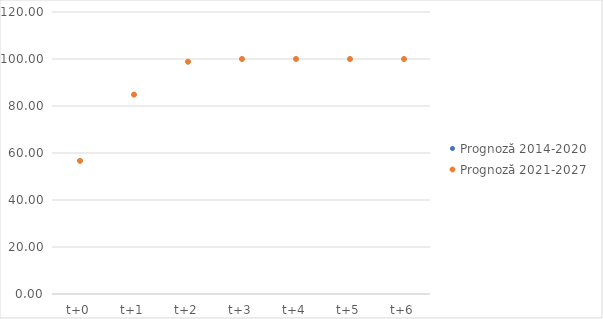
| Category | Prognoză 2014-2020 | Prognoză 2021-2027 |
|---|---|---|
| t+0 | 56.655 | 56.655 |
| t+1 | 84.83 | 84.83 |
| t+2 | 98.841 | 98.841 |
| t+3 | 100 | 100 |
| t+4 | 100 | 100 |
| t+5 | 100 | 100 |
| t+6 | 100 | 100 |